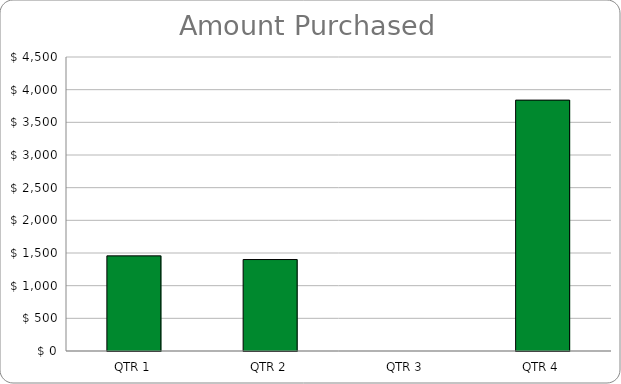
| Category | Amount Purchases |
|---|---|
| QTR 1 | 1456 |
| QTR 2 | 1400 |
| QTR 3 | 0 |
| QTR 4 | 3840 |